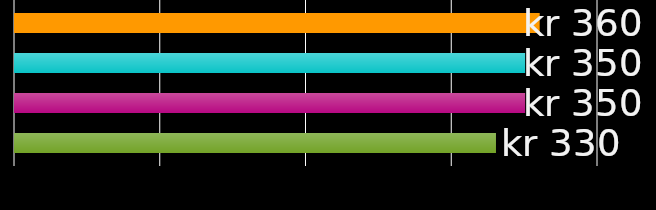
| Category | romkamerat 1 | romkamerat 2 | romkamerat 3 | romkamerat 4 |
|---|---|---|---|---|
| 0 | 360 | 350 | 350 | 330 |